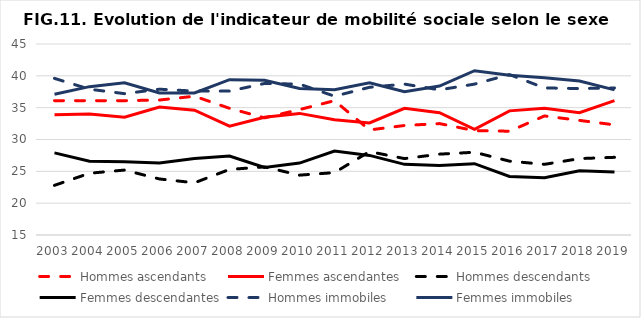
| Category | Hommes ascendants | Femmes ascendantes | Hommes descendants | Femmes descendantes | Hommes immobiles | Femmes immobiles |
|---|---|---|---|---|---|---|
| 2003.0 | 36.1 | 33.9 | 22.8 | 27.9 | 39.6 | 37.1 |
| 2004.0 | 36.1 | 34 | 24.7 | 26.6 | 37.9 | 38.3 |
| 2005.0 | 36.1 | 33.5 | 25.2 | 26.5 | 37.2 | 38.9 |
| 2006.0 | 36.2 | 35.1 | 23.8 | 26.3 | 37.9 | 37.3 |
| 2007.0 | 36.8 | 34.6 | 23.2 | 27 | 37.6 | 37.3 |
| 2008.0 | 34.9 | 32.1 | 25.3 | 27.4 | 37.6 | 39.4 |
| 2009.0 | 33.4 | 33.5 | 25.7 | 25.6 | 38.8 | 39.3 |
| 2010.0 | 34.7 | 34.1 | 24.4 | 26.3 | 38.7 | 38 |
| 2011.0 | 36.1 | 33.1 | 24.8 | 28.2 | 36.8 | 37.8 |
| 2012.0 | 31.5 | 32.6 | 28.1 | 27.5 | 38.2 | 38.9 |
| 2013.0 | 32.2 | 34.9 | 27 | 26.1 | 38.7 | 37.5 |
| 2014.0 | 32.5 | 34.2 | 27.7 | 25.9 | 37.8 | 38.4 |
| 2015.0 | 31.4 | 31.6 | 28 | 26.2 | 38.7 | 40.8 |
| 2016.0 | 31.3 | 34.5 | 26.6 | 24.2 | 40.2 | 40.1 |
| 2017.0 | 33.7 | 34.9 | 26.1 | 24 | 38.1 | 39.7 |
| 2018.0 | 33 | 34.2 | 27 | 25.1 | 38 | 39.2 |
| 2019.0 | 32.3 | 36.1 | 27.2 | 24.9 | 38.1 | 37.8 |